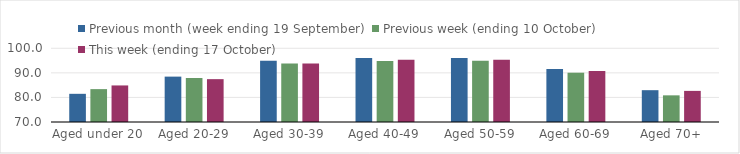
| Category | Previous month (week ending 19 September) | Previous week (ending 10 October) | This week (ending 17 October) |
|---|---|---|---|
| Aged under 20 | 81.47 | 83.38 | 84.88 |
| Aged 20-29 | 88.47 | 87.9 | 87.44 |
| Aged 30-39 | 94.91 | 93.76 | 93.76 |
| Aged 40-49 | 96.07 | 94.85 | 95.29 |
| Aged 50-59 | 96.02 | 94.97 | 95.31 |
| Aged 60-69 | 91.61 | 90.06 | 90.77 |
| Aged 70+ | 82.95 | 80.85 | 82.66 |